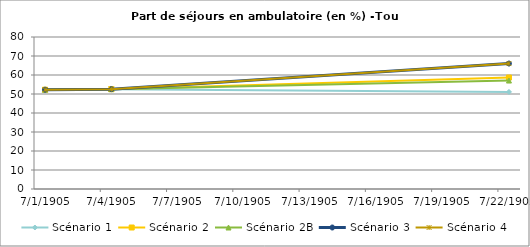
| Category | Scénario 1 | Scénario 2 | Scénario 2B | Scénario 3 | Scénario 4 |
|---|---|---|---|---|---|
| 2009.0 | 52.263 | 52.263 | 52.263 | 52.263 | 52.263 |
| 2012.0 | 52.556 | 52.556 | 52.556 | 52.556 | 52.556 |
| 2030.0 | 51.089 | 58.668 | 57.088 | 66.036 | 66.036 |